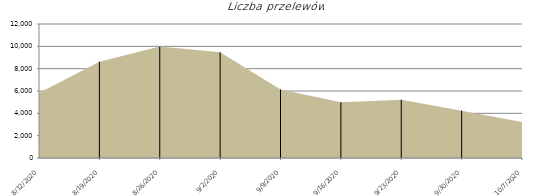
| Category | Liczba przelewów |
|---|---|
| 8/12/20 | 5814 |
| 8/19/20 | 8625 |
| 8/26/20 | 9980 |
| 9/2/20 | 9479 |
| 9/9/20 | 6130 |
| 9/16/20 | 4996 |
| 9/23/20 | 5219 |
| 9/30/20 | 4240 |
| 10/7/20 | 3235 |